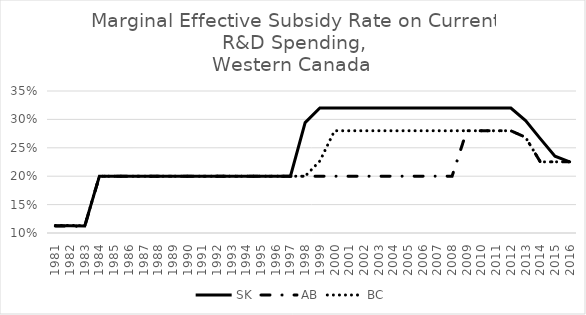
| Category | SK | AB | BC |
|---|---|---|---|
| 1981.0 | 0.113 | 0.112 | 0.113 |
| 1982.0 | 0.113 | 0.112 | 0.113 |
| 1983.0 | 0.112 | 0.112 | 0.113 |
| 1984.0 | 0.2 | 0.2 | 0.2 |
| 1985.0 | 0.2 | 0.2 | 0.2 |
| 1986.0 | 0.2 | 0.2 | 0.2 |
| 1987.0 | 0.2 | 0.2 | 0.2 |
| 1988.0 | 0.2 | 0.2 | 0.2 |
| 1989.0 | 0.2 | 0.2 | 0.2 |
| 1990.0 | 0.2 | 0.2 | 0.2 |
| 1991.0 | 0.2 | 0.2 | 0.2 |
| 1992.0 | 0.2 | 0.2 | 0.2 |
| 1993.0 | 0.2 | 0.2 | 0.2 |
| 1994.0 | 0.2 | 0.2 | 0.2 |
| 1995.0 | 0.2 | 0.2 | 0.2 |
| 1996.0 | 0.2 | 0.2 | 0.2 |
| 1997.0 | 0.2 | 0.2 | 0.2 |
| 1998.0 | 0.294 | 0.2 | 0.2 |
| 1999.0 | 0.32 | 0.2 | 0.227 |
| 2000.0 | 0.32 | 0.2 | 0.28 |
| 2001.0 | 0.32 | 0.2 | 0.28 |
| 2002.0 | 0.32 | 0.2 | 0.28 |
| 2003.0 | 0.32 | 0.2 | 0.28 |
| 2004.0 | 0.32 | 0.2 | 0.28 |
| 2005.0 | 0.32 | 0.2 | 0.28 |
| 2006.0 | 0.32 | 0.2 | 0.28 |
| 2007.0 | 0.32 | 0.2 | 0.28 |
| 2008.0 | 0.32 | 0.2 | 0.28 |
| 2009.0 | 0.32 | 0.28 | 0.28 |
| 2010.0 | 0.32 | 0.28 | 0.28 |
| 2011.0 | 0.32 | 0.28 | 0.28 |
| 2012.0 | 0.32 | 0.28 | 0.28 |
| 2013.0 | 0.298 | 0.268 | 0.268 |
| 2014.0 | 0.266 | 0.225 | 0.225 |
| 2015.0 | 0.235 | 0.225 | 0.225 |
| 2016.0 | 0.225 | 0.225 | 0.225 |